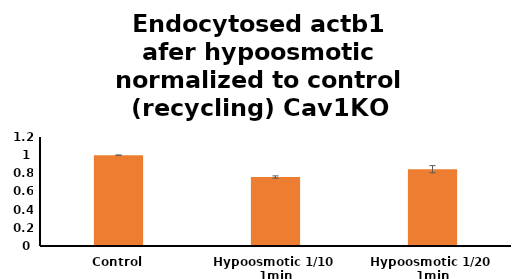
| Category | Cav1KO MEFs |
|---|---|
| Control | 1 |
| Hypoosmotic 1/10  1min | 0.759 |
| Hypoosmotic 1/20  1min | 0.845 |